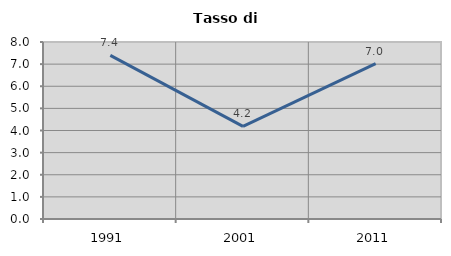
| Category | Tasso di disoccupazione   |
|---|---|
| 1991.0 | 7.397 |
| 2001.0 | 4.186 |
| 2011.0 | 7.022 |